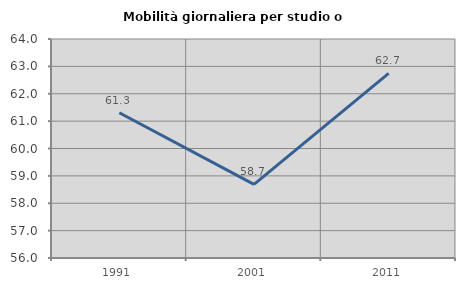
| Category | Mobilità giornaliera per studio o lavoro |
|---|---|
| 1991.0 | 61.307 |
| 2001.0 | 58.687 |
| 2011.0 | 62.743 |